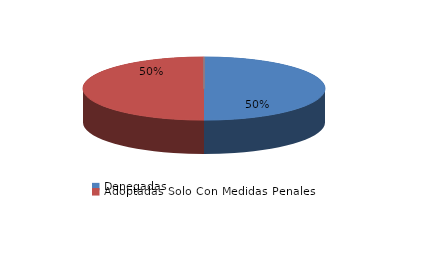
| Category | Series 0 |
|---|---|
| Denegadas | 1 |
| Adoptadas Solo Con Medidas Penales | 1 |
| Adoptadas Con Medidas Civiles Y Penales | 0 |
| Adoptadas Con Medidas Solo Civiles | 0 |